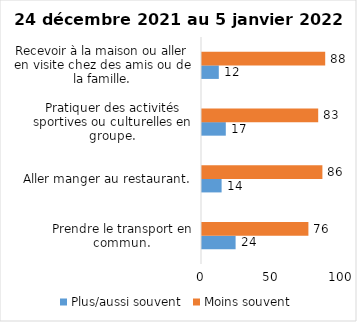
| Category | Plus/aussi souvent | Moins souvent |
|---|---|---|
| Prendre le transport en commun. | 24 | 76 |
| Aller manger au restaurant. | 14 | 86 |
| Pratiquer des activités sportives ou culturelles en groupe. | 17 | 83 |
| Recevoir à la maison ou aller en visite chez des amis ou de la famille. | 12 | 88 |